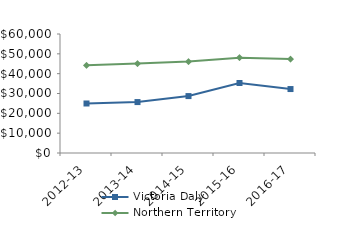
| Category | Victoria Daly | Northern Territory |
|---|---|---|
| 2012-13 | 24961.17 | 44232.02 |
| 2013-14 | 25677.01 | 45075.51 |
| 2014-15 | 28697.35 | 46083.65 |
| 2015-16 | 35288 | 48046.27 |
| 2016-17 | 32243.88 | 47367.05 |